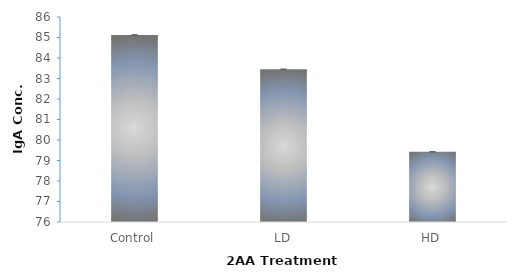
| Category | Series 0 |
|---|---|
| 0 | 85.122 |
| 1 | 83.452 |
| 2 | 79.424 |